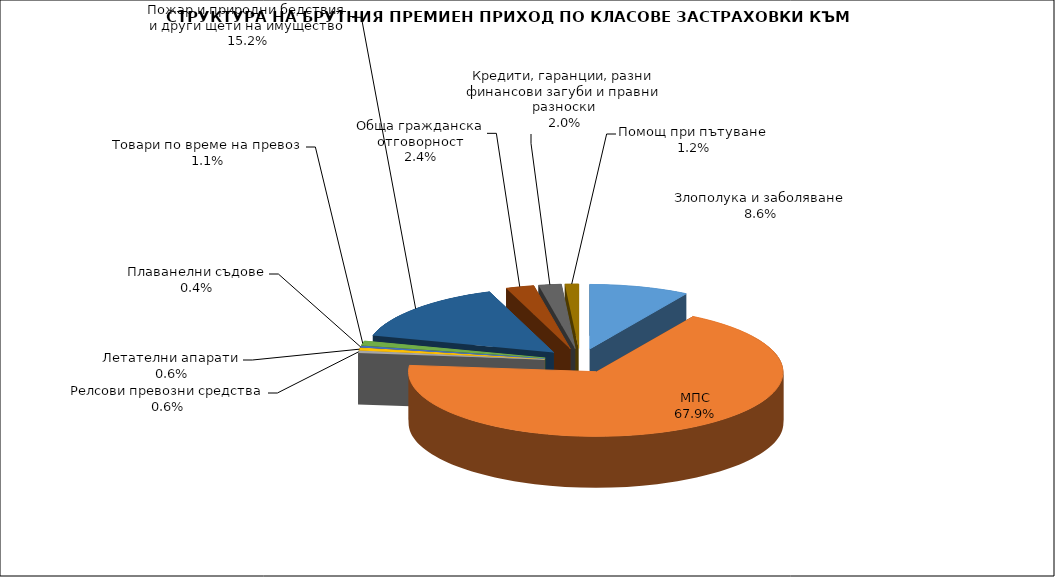
| Category | Злополука и заболяване |
|---|---|
| Злополука и заболяване | 0.086 |
| МПС | 0.679 |
| Релсови превозни средства | 0.006 |
| Летателни апарати | 0.006 |
| Плаванелни съдове | 0.004 |
| Товари по време на превоз | 0.011 |
| Пожар и природни бедствия и други щети на имущество | 0.152 |
| Обща гражданска отговорност | 0.024 |
| Кредити, гаранции, разни финансови загуби и правни разноски | 0.02 |
| Помощ при пътуване | 0.012 |